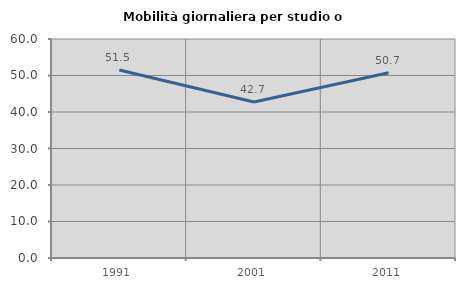
| Category | Mobilità giornaliera per studio o lavoro |
|---|---|
| 1991.0 | 51.522 |
| 2001.0 | 42.736 |
| 2011.0 | 50.746 |